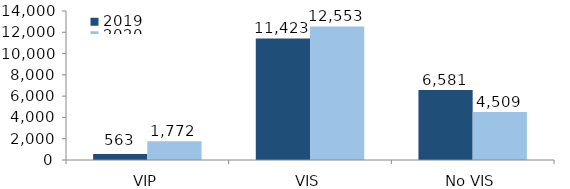
| Category | 2019 | 2020 |
|---|---|---|
| VIP | 563 | 1772 |
| VIS | 11423 | 12553 |
| No VIS | 6581 | 4509 |